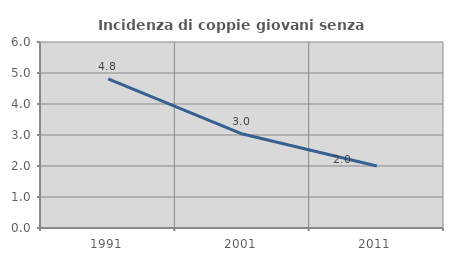
| Category | Incidenza di coppie giovani senza figli |
|---|---|
| 1991.0 | 4.812 |
| 2001.0 | 3.03 |
| 2011.0 | 2 |